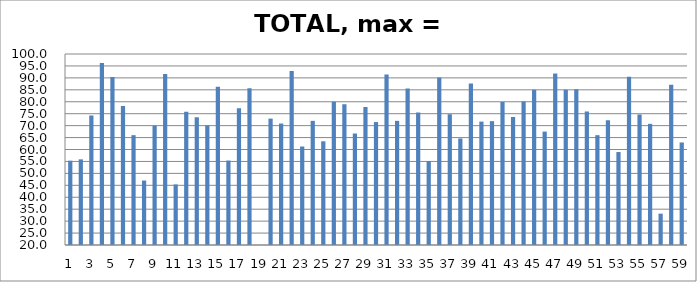
| Category | Series 0 |
|---|---|
| 0 | 55.312 |
| 1 | 55.875 |
| 2 | 74.25 |
| 3 | 96.25 |
| 4 | 90.375 |
| 5 | 78.25 |
| 6 | 66 |
| 7 | 47 |
| 8 | 70 |
| 9 | 91.625 |
| 10 | 45.375 |
| 11 | 75.812 |
| 12 | 73.5 |
| 13 | 70.125 |
| 14 | 86.312 |
| 15 | 55.375 |
| 16 | 77.312 |
| 17 | 85.688 |
| 18 | 16.75 |
| 19 | 72.938 |
| 20 | 70.875 |
| 21 | 92.875 |
| 22 | 61.25 |
| 23 | 72 |
| 24 | 63.438 |
| 25 | 80 |
| 26 | 79 |
| 27 | 66.688 |
| 28 | 77.75 |
| 29 | 71.5 |
| 30 | 91.438 |
| 31 | 72 |
| 32 | 85.562 |
| 33 | 75.5 |
| 34 | 55.125 |
| 35 | 90.125 |
| 36 | 74.812 |
| 37 | 64.625 |
| 38 | 87.625 |
| 39 | 71.688 |
| 40 | 71.875 |
| 41 | 79.875 |
| 42 | 73.625 |
| 43 | 80.125 |
| 44 | 85 |
| 45 | 67.5 |
| 46 | 91.812 |
| 47 | 85.062 |
| 48 | 85.25 |
| 49 | 75.875 |
| 50 | 66 |
| 51 | 72.25 |
| 52 | 58.938 |
| 53 | 90.5 |
| 54 | 74.625 |
| 55 | 70.75 |
| 56 | 33.125 |
| 57 | 87.125 |
| 58 | 62.938 |